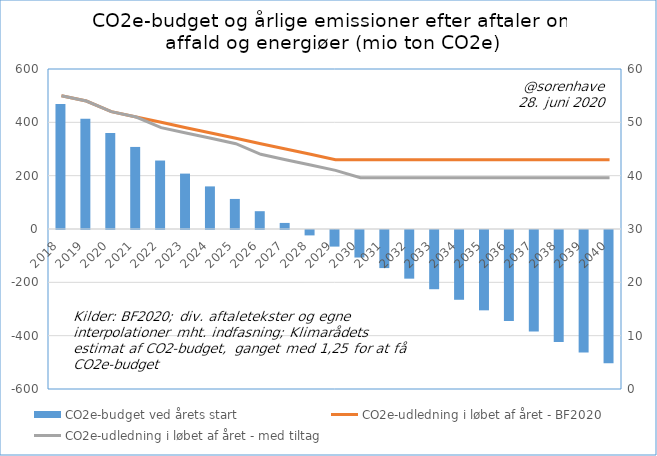
| Category | CO2e-budget ved årets start |
|---|---|
| 2018.0 | 468.75 |
| 2019.0 | 413.75 |
| 2020.0 | 359.75 |
| 2021.0 | 307.75 |
| 2022.0 | 256.75 |
| 2023.0 | 207.75 |
| 2024.0 | 159.75 |
| 2025.0 | 112.75 |
| 2026.0 | 66.75 |
| 2027.0 | 22.75 |
| 2028.0 | -20.25 |
| 2029.0 | -62.25 |
| 2030.0 | -103.25 |
| 2031.0 | -142.85 |
| 2032.0 | -182.45 |
| 2033.0 | -222.05 |
| 2034.0 | -261.65 |
| 2035.0 | -301.25 |
| 2036.0 | -340.85 |
| 2037.0 | -380.45 |
| 2038.0 | -420.05 |
| 2039.0 | -459.65 |
| 2040.0 | -499.25 |